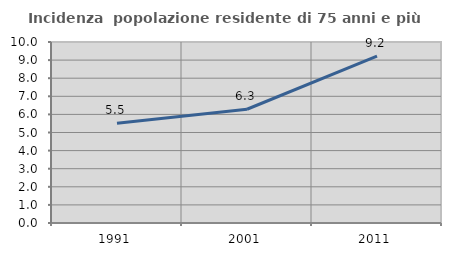
| Category | Incidenza  popolazione residente di 75 anni e più |
|---|---|
| 1991.0 | 5.509 |
| 2001.0 | 6.285 |
| 2011.0 | 9.223 |